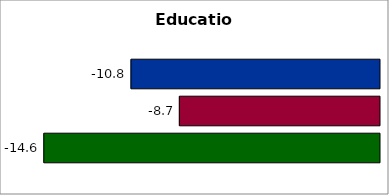
| Category | 50 states and D.C. | SREB states | State |
|---|---|---|---|
| 0 | -10.776 | -8.678 | -14.555 |